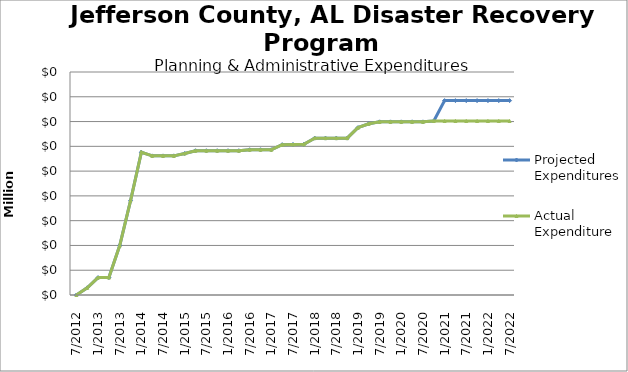
| Category | Projected Expenditures | Actual Expenditure |
|---|---|---|
| 7/2012 | 0 | 0 |
| 10/2012 | 14612 | 14612.19 |
| 1/2013 | 35137 | 35137.15 |
| 4/2013 | 35137 | 35137.15 |
| 7/2013 | 99693 | 99693.07 |
| 10/2013 | 190645 | 190645.12 |
| 1/2014 | 288122 | 288121.83 |
| 4/2014 | 280763 | 280762.67 |
| 7/2014 | 280763 | 280762.67 |
| 10/2014 | 280763 | 280762.67 |
| 1/2015 | 285576 | 285576.16 |
| 4/2015 | 291185 | 291185.14 |
| 7/2015 | 291185 | 291185.14 |
| 10/2015 | 291185 | 291185.14 |
| 1/2016 | 291185 | 291185.14 |
| 4/2016 | 291185 | 291185.14 |
| 7/2016 | 293188 | 293187.81 |
| 10/2016 | 293188 | 293187.81 |
| 1/2017 | 293188 | 293187.81 |
| 4/2017 | 303439 | 303438.36 |
| 7/2017 | 303712 | 303711.78 |
| 10/2017 | 303982 | 303981.28 |
| 1/2018 | 316544 | 316543.24 |
| 4/2018 | 316544 | 316543.24 |
| 7/2018 | 316544 | 316543.24 |
| 10/2018 | 316544 | 316543.24 |
| 1/2019 | 337699 | 337698.47 |
| 4/2019 | 345617 | 345616.53 |
| 7/2019 | 349427 | 349426.36 |
| 10/2019 | 349427 | 349426.36 |
| 1/2020 | 349427 | 349426.36 |
| 4/2020 | 349427 | 349426.36 |
| 7/2020 | 349427 | 349426.36 |
| 10/2020 | 351156 | 351155.74 |
| 1/2021 | 392254.2 | 351155.74 |
| 4/2021 | 392254.2 | 351155.74 |
| 7/2021 | 392254.2 | 351155.74 |
| 10/2021 | 392254.2 | 351155.74 |
| 1/2022 | 392254.2 | 351155.74 |
| 4/2022 | 392254.2 | 351155.74 |
| 7/2022 | 392254.2 | 351155.74 |